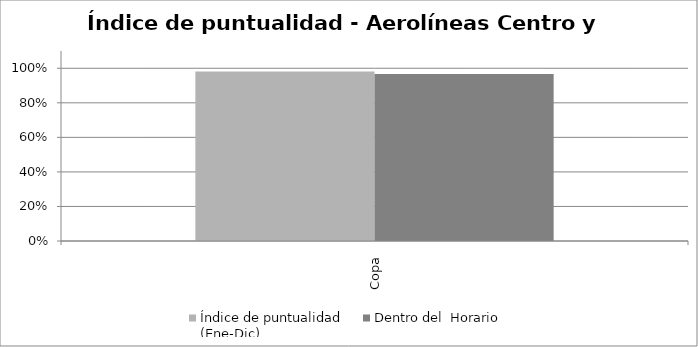
| Category | Índice de puntualidad
(Ene-Dic) | Dentro del  Horario |
|---|---|---|
| Copa | 0.981 | 0.967 |